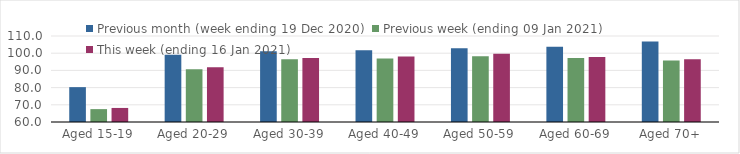
| Category | Previous month (week ending 19 Dec 2020) | Previous week (ending 09 Jan 2021) | This week (ending 16 Jan 2021) |
|---|---|---|---|
| Aged 15-19 | 80.27 | 67.49 | 68.17 |
| Aged 20-29 | 99.15 | 90.73 | 91.78 |
| Aged 30-39 | 101.2 | 96.52 | 97.25 |
| Aged 40-49 | 101.66 | 96.91 | 98.06 |
| Aged 50-59 | 102.94 | 98.21 | 99.61 |
| Aged 60-69 | 103.72 | 97.15 | 97.75 |
| Aged 70+ | 106.77 | 95.71 | 96.41 |